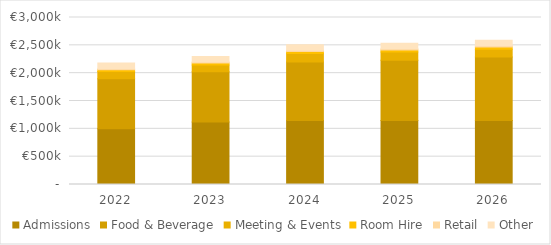
| Category | Admissions | Food & Beverage | Meeting & Events | Room Hire | Retail | Other |
|---|---|---|---|---|---|---|
| 2022.0 | 1000000 | 900000 | 130000 | 32500 | 18000 | 100000 |
| 2023.0 | 1125000 | 900000 | 122400 | 34000 | 19000 | 100000 |
| 2024.0 | 1150000 | 1050000 | 152640 | 36000 | 22000 | 100000 |
| 2025.0 | 1150000 | 1080000 | 148000 | 37000 | 23000 | 100000 |
| 2026.0 | 1150000 | 1140000 | 141000 | 37500 | 24000 | 100000 |